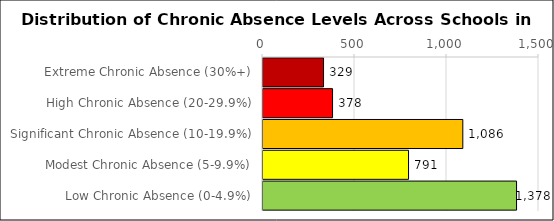
| Category | Number of Schools |
|---|---|
| Extreme Chronic Absence (30%+) | 329 |
| High Chronic Absence (20-29.9%) | 378 |
| Significant Chronic Absence (10-19.9%) | 1086 |
| Modest Chronic Absence (5-9.9%) | 791 |
| Low Chronic Absence (0-4.9%) | 1378 |